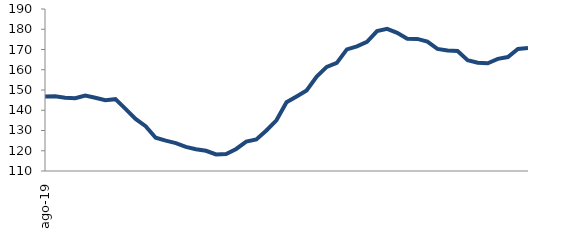
| Category | Series 1 |
|---|---|
| 2019-08-01 | 146.814 |
| 2019-09-01 | 146.921 |
| 2019-10-01 | 146.216 |
| 2019-11-01 | 145.952 |
| 2019-12-01 | 147.284 |
| 2020-01-01 | 146.194 |
| 2020-02-01 | 144.98 |
| 2020-03-01 | 145.471 |
| 2020-04-01 | 140.66 |
| 2020-05-01 | 135.678 |
| 2020-06-01 | 132.14 |
| 2020-07-01 | 126.404 |
| 2020-08-01 | 124.978 |
| 2020-09-01 | 123.76 |
| 2020-10-01 | 121.904 |
| 2020-11-01 | 120.729 |
| 2020-12-01 | 119.982 |
| 2021-01-01 | 118.16 |
| 2021-02-01 | 118.385 |
| 2021-03-01 | 120.897 |
| 2021-04-01 | 124.521 |
| 2021-05-01 | 125.561 |
| 2021-06-01 | 129.991 |
| 2021-07-01 | 135.036 |
| 2021-08-01 | 143.93 |
| 2021-09-01 | 146.816 |
| 2021-10-01 | 149.733 |
| 2021-11-01 | 156.598 |
| 2021-12-01 | 161.424 |
| 2022-01-01 | 163.409 |
| 2022-02-01 | 170.051 |
| 2022-03-01 | 171.561 |
| 2022-04-01 | 173.768 |
| 2022-05-01 | 179.049 |
| 2022-06-01 | 180.219 |
| 2022-07-01 | 178.235 |
| 2022-08-01 | 175.283 |
| 2022-09-01 | 175.244 |
| 2022-10-01 | 173.855 |
| 2022-11-01 | 170.303 |
| 2022-12-01 | 169.507 |
| 2023-01-01 | 169.264 |
| 2023-02-01 | 164.751 |
| 2023-03-01 | 163.49 |
| 2023-04-01 | 163.213 |
| 2023-05-01 | 165.362 |
| 2023-06-01 | 166.293 |
| 2023-07-01 | 170.283 |
| 2023-08-01 | 170.701 |